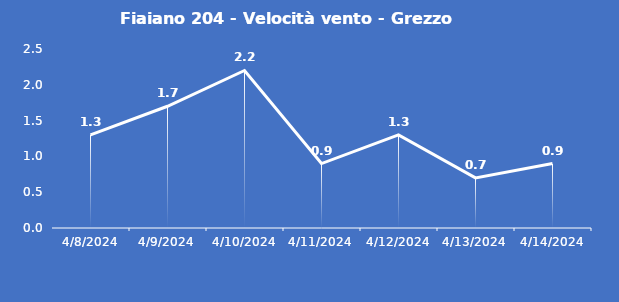
| Category | Fiaiano 204 - Velocità vento - Grezzo (m/s) |
|---|---|
| 4/8/24 | 1.3 |
| 4/9/24 | 1.7 |
| 4/10/24 | 2.2 |
| 4/11/24 | 0.9 |
| 4/12/24 | 1.3 |
| 4/13/24 | 0.7 |
| 4/14/24 | 0.9 |